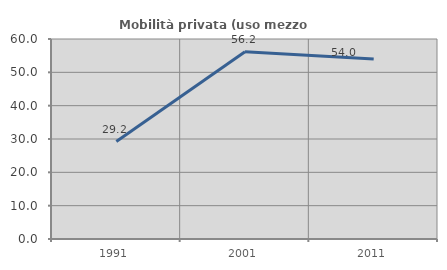
| Category | Mobilità privata (uso mezzo privato) |
|---|---|
| 1991.0 | 29.23 |
| 2001.0 | 56.174 |
| 2011.0 | 53.987 |